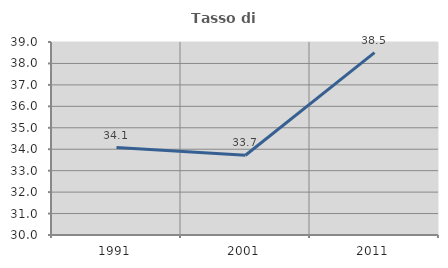
| Category | Tasso di occupazione   |
|---|---|
| 1991.0 | 34.078 |
| 2001.0 | 33.721 |
| 2011.0 | 38.502 |